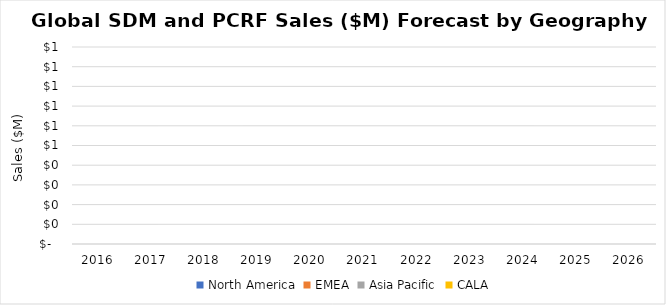
| Category | North America | EMEA | Asia Pacific | CALA |
|---|---|---|---|---|
| 2016.0 | 0 | 0 | 0 | 0 |
| 2017.0 | 0 | 0 | 0 | 0 |
| 2018.0 | 0 | 0 | 0 | 0 |
| 2019.0 | 0 | 0 | 0 | 0 |
| 2020.0 | 0 | 0 | 0 | 0 |
| 2021.0 | 0 | 0 | 0 | 0 |
| 2022.0 | 0 | 0 | 0 | 0 |
| 2023.0 | 0 | 0 | 0 | 0 |
| 2024.0 | 0 | 0 | 0 | 0 |
| 2025.0 | 0 | 0 | 0 | 0 |
| 2026.0 | 0 | 0 | 0 | 0 |